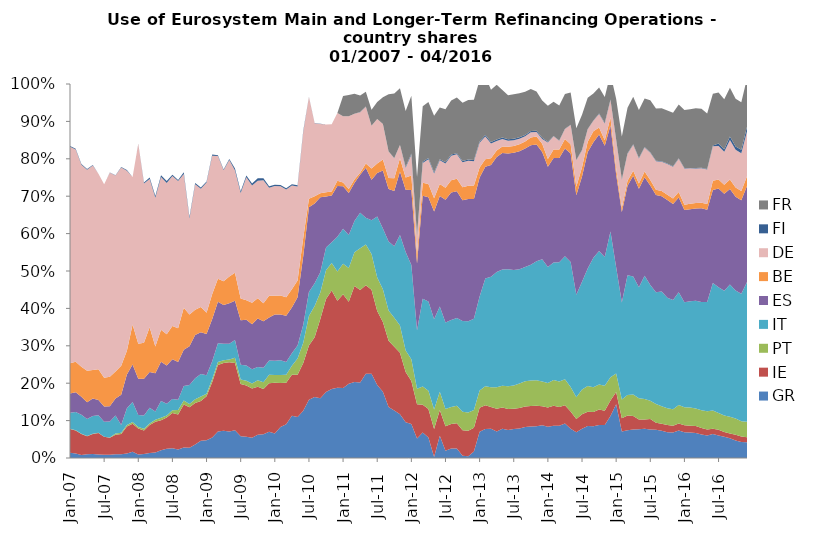
| Category | GR | IE | PT | IT | ES | BE | DE | FI | FR |
|---|---|---|---|---|---|---|---|---|---|
| 2007-01-01 | 0.014 | 0.064 | 0 | 0.043 | 0.051 | 0.081 | 0.579 | 0.002 | 0 |
| 2007-02-01 | 0.012 | 0.062 | 0 | 0.048 | 0.053 | 0.081 | 0.568 | 0.002 | 0 |
| 2007-03-01 | 0.008 | 0.056 | 0 | 0.051 | 0.048 | 0.08 | 0.54 | 0.002 | 0 |
| 2007-04-01 | 0.01 | 0.048 | 0.001 | 0.045 | 0.045 | 0.084 | 0.538 | 0.002 | 0 |
| 2007-05-01 | 0.011 | 0.053 | 0 | 0.048 | 0.047 | 0.076 | 0.547 | 0.001 | 0 |
| 2007-06-01 | 0.009 | 0.057 | 0.001 | 0.047 | 0.041 | 0.082 | 0.522 | 0 | 0 |
| 2007-07-01 | 0.009 | 0.048 | 0 | 0.04 | 0.041 | 0.077 | 0.518 | 0 | 0 |
| 2007-08-01 | 0.009 | 0.046 | 0.001 | 0.043 | 0.041 | 0.079 | 0.546 | 0 | 0 |
| 2007-09-01 | 0.01 | 0.052 | 0.003 | 0.048 | 0.046 | 0.072 | 0.524 | 0.001 | 0 |
| 2007-10-01 | 0.01 | 0.054 | 0.003 | 0.021 | 0.081 | 0.077 | 0.53 | 0.001 | 0 |
| 2007-11-01 | 0.012 | 0.072 | 0.004 | 0.045 | 0.09 | 0.064 | 0.481 | 0.002 | 0 |
| 2007-12-01 | 0.017 | 0.075 | 0.005 | 0.054 | 0.1 | 0.107 | 0.394 | 0 | 0 |
| 2008-01-01 | 0.009 | 0.069 | 0.004 | 0.032 | 0.096 | 0.094 | 0.535 | 0 | 0 |
| 2008-02-01 | 0.011 | 0.063 | 0.005 | 0.035 | 0.098 | 0.096 | 0.425 | 0.002 | 0 |
| 2008-03-01 | 0.014 | 0.075 | 0.004 | 0.042 | 0.096 | 0.12 | 0.396 | 0.004 | 0 |
| 2008-04-01 | 0.015 | 0.082 | 0.006 | 0.022 | 0.102 | 0.072 | 0.398 | 0.004 | 0 |
| 2008-05-01 | 0.021 | 0.08 | 0.007 | 0.045 | 0.105 | 0.086 | 0.409 | 0.005 | 0 |
| 2008-06-01 | 0.025 | 0.083 | 0.005 | 0.032 | 0.102 | 0.083 | 0.404 | 0.005 | 0 |
| 2008-07-01 | 0.026 | 0.095 | 0.007 | 0.03 | 0.106 | 0.089 | 0.401 | 0.004 | 0 |
| 2008-08-01 | 0.023 | 0.093 | 0.012 | 0.027 | 0.101 | 0.09 | 0.394 | 0.003 | 0 |
| 2008-09-01 | 0.028 | 0.115 | 0.011 | 0.038 | 0.097 | 0.112 | 0.358 | 0.005 | 0 |
| 2008-10-01 | 0.027 | 0.108 | 0.009 | 0.051 | 0.104 | 0.085 | 0.257 | 0.004 | 0 |
| 2008-11-01 | 0.036 | 0.111 | 0.01 | 0.056 | 0.115 | 0.067 | 0.336 | 0.003 | 0 |
| 2008-12-01 | 0.046 | 0.106 | 0.012 | 0.06 | 0.111 | 0.068 | 0.317 | 0.003 | 0 |
| 2009-01-01 | 0.047 | 0.117 | 0.007 | 0.05 | 0.11 | 0.057 | 0.348 | 0.002 | 0 |
| 2009-02-01 | 0.055 | 0.148 | 0.007 | 0.048 | 0.112 | 0.067 | 0.37 | 0.003 | 0 |
| 2009-03-01 | 0.071 | 0.178 | 0.008 | 0.05 | 0.111 | 0.062 | 0.328 | 0.002 | 0 |
| 2009-04-01 | 0.073 | 0.181 | 0.007 | 0.044 | 0.104 | 0.064 | 0.296 | 0.002 | 0 |
| 2009-05-01 | 0.071 | 0.185 | 0.008 | 0.042 | 0.108 | 0.071 | 0.312 | 0.002 | 0 |
| 2009-06-01 | 0.074 | 0.18 | 0.015 | 0.047 | 0.105 | 0.075 | 0.273 | 0.005 | 0 |
| 2009-07-01 | 0.058 | 0.14 | 0.012 | 0.04 | 0.119 | 0.058 | 0.282 | 0.005 | 0 |
| 2009-08-01 | 0.057 | 0.137 | 0.013 | 0.041 | 0.122 | 0.052 | 0.329 | 0.005 | 0 |
| 2009-09-01 | 0.054 | 0.132 | 0.013 | 0.038 | 0.121 | 0.057 | 0.314 | 0.005 | 0 |
| 2009-10-01 | 0.062 | 0.129 | 0.017 | 0.036 | 0.13 | 0.054 | 0.314 | 0.006 | 0 |
| 2009-11-01 | 0.064 | 0.121 | 0.018 | 0.038 | 0.125 | 0.048 | 0.329 | 0.005 | 0 |
| 2009-12-01 | 0.07 | 0.13 | 0.023 | 0.038 | 0.115 | 0.058 | 0.289 | 0.004 | 0 |
| 2010-01-01 | 0.066 | 0.135 | 0.021 | 0.038 | 0.124 | 0.05 | 0.293 | 0.004 | 0 |
| 2010-02-01 | 0.083 | 0.118 | 0.021 | 0.039 | 0.123 | 0.05 | 0.292 | 0.003 | 0 |
| 2010-03-01 | 0.09 | 0.111 | 0.021 | 0.034 | 0.124 | 0.05 | 0.288 | 0.003 | 0 |
| 2010-04-01 | 0.113 | 0.109 | 0.024 | 0.034 | 0.122 | 0.049 | 0.277 | 0.003 | 0 |
| 2010-05-01 | 0.109 | 0.113 | 0.043 | 0.035 | 0.129 | 0.044 | 0.251 | 0.003 | 0 |
| 2010-06-01 | 0.127 | 0.127 | 0.054 | 0.048 | 0.184 | 0.049 | 0.283 | 0.003 | 0 |
| 2010-07-01 | 0.156 | 0.145 | 0.079 | 0.064 | 0.227 | 0.022 | 0.272 | 0.001 | 0 |
| 2010-08-01 | 0.163 | 0.16 | 0.084 | 0.06 | 0.214 | 0.019 | 0.195 | 0.001 | 0 |
| 2010-09-01 | 0.16 | 0.212 | 0.071 | 0.054 | 0.201 | 0.011 | 0.185 | 0.001 | 0 |
| 2010-10-01 | 0.177 | 0.249 | 0.077 | 0.061 | 0.136 | 0.011 | 0.181 | 0 | 0 |
| 2010-11-01 | 0.184 | 0.264 | 0.074 | 0.056 | 0.125 | 0.011 | 0.18 | 0 | 0 |
| 2010-12-01 | 0.188 | 0.233 | 0.078 | 0.093 | 0.136 | 0.014 | 0.181 | 0 | 0 |
| 2011-01-01 | 0.187 | 0.25 | 0.081 | 0.094 | 0.113 | 0.01 | 0.177 | 0 | 0.054 |
| 2011-02-01 | 0.199 | 0.219 | 0.09 | 0.088 | 0.112 | 0.011 | 0.195 | 0 | 0.057 |
| 2011-03-01 | 0.203 | 0.257 | 0.09 | 0.083 | 0.101 | 0.01 | 0.176 | 0 | 0.054 |
| 2011-04-01 | 0.202 | 0.247 | 0.112 | 0.095 | 0.102 | 0.005 | 0.162 | 0 | 0.044 |
| 2011-05-01 | 0.225 | 0.236 | 0.109 | 0.071 | 0.134 | 0.012 | 0.152 | 0 | 0.04 |
| 2011-06-01 | 0.225 | 0.225 | 0.096 | 0.09 | 0.108 | 0.03 | 0.114 | 0 | 0.043 |
| 2011-07-01 | 0.195 | 0.198 | 0.09 | 0.163 | 0.116 | 0.025 | 0.119 | 0 | 0.045 |
| 2011-08-01 | 0.177 | 0.186 | 0.088 | 0.162 | 0.155 | 0.029 | 0.095 | 0 | 0.071 |
| 2011-09-01 | 0.137 | 0.177 | 0.081 | 0.185 | 0.14 | 0.029 | 0.071 | 0 | 0.153 |
| 2011-10-01 | 0.127 | 0.17 | 0.078 | 0.191 | 0.148 | 0.034 | 0.054 | 0 | 0.172 |
| 2011-11-01 | 0.117 | 0.164 | 0.073 | 0.242 | 0.17 | 0.036 | 0.035 | 0 | 0.152 |
| 2011-12-01 | 0.096 | 0.134 | 0.058 | 0.264 | 0.166 | 0.033 | 0.026 | 0.003 | 0.149 |
| 2012-01-01 | 0.091 | 0.115 | 0.058 | 0.252 | 0.201 | 0.039 | 0.056 | 0.003 | 0.155 |
| 2012-02-01 | 0.052 | 0.092 | 0.042 | 0.156 | 0.179 | 0.024 | 0.051 | 0.002 | 0.154 |
| 2012-03-01 | 0.068 | 0.074 | 0.049 | 0.235 | 0.275 | 0.035 | 0.053 | 0.003 | 0.149 |
| 2012-04-01 | 0.055 | 0.076 | 0.049 | 0.239 | 0.279 | 0.035 | 0.066 | 0.003 | 0.15 |
| 2012-05-01 | 0.003 | 0.075 | 0.052 | 0.242 | 0.288 | 0.035 | 0.066 | 0.003 | 0.151 |
| 2012-06-01 | 0.06 | 0.069 | 0.049 | 0.228 | 0.295 | 0.032 | 0.063 | 0.003 | 0.138 |
| 2012-07-31 | 0.02 | 0.065 | 0.046 | 0.231 | 0.328 | 0.032 | 0.065 | 0.003 | 0.142 |
| 2012-08-31 | 0.026 | 0.066 | 0.045 | 0.232 | 0.341 | 0.033 | 0.065 | 0.003 | 0.145 |
| 2012-09-30 | 0.026 | 0.067 | 0.047 | 0.234 | 0.339 | 0.034 | 0.065 | 0.003 | 0.149 |
| 2012-10-31 | 0.006 | 0.069 | 0.049 | 0.243 | 0.322 | 0.035 | 0.067 | 0.003 | 0.156 |
| 2012-11-30 | 0.005 | 0.068 | 0.049 | 0.244 | 0.326 | 0.036 | 0.067 | 0.003 | 0.159 |
| 2012-12-31 | 0.017 | 0.064 | 0.047 | 0.244 | 0.32 | 0.036 | 0.065 | 0.003 | 0.161 |
| 2013-01-31 | 0.07 | 0.064 | 0.046 | 0.252 | 0.318 | 0.027 | 0.066 | 0.003 | 0.165 |
| 2013-02-28 | 0.077 | 0.064 | 0.051 | 0.289 | 0.299 | 0.02 | 0.061 | 0.004 | 0.157 |
| 2013-03-31 | 0.078 | 0.059 | 0.053 | 0.296 | 0.299 | 0.018 | 0.039 | 0.004 | 0.14 |
| 2013-04-30 | 0.071 | 0.061 | 0.058 | 0.308 | 0.307 | 0.018 | 0.025 | 0.004 | 0.146 |
| 2013-05-31 | 0.078 | 0.056 | 0.058 | 0.311 | 0.311 | 0.017 | 0.02 | 0.004 | 0.127 |
| 2013-06-30 | 0.075 | 0.056 | 0.06 | 0.313 | 0.31 | 0.018 | 0.016 | 0.004 | 0.118 |
| 2013-07-31 | 0.077 | 0.054 | 0.062 | 0.308 | 0.314 | 0.018 | 0.015 | 0.004 | 0.119 |
| 2013-08-31 | 0.079 | 0.055 | 0.065 | 0.306 | 0.316 | 0.018 | 0.015 | 0.004 | 0.118 |
| 2013-09-30 | 0.083 | 0.055 | 0.067 | 0.305 | 0.317 | 0.019 | 0.014 | 0.003 | 0.116 |
| 2013-10-31 | 0.084 | 0.055 | 0.068 | 0.31 | 0.319 | 0.021 | 0.014 | 0.003 | 0.112 |
| 2013-11-30 | 0.085 | 0.055 | 0.068 | 0.318 | 0.312 | 0.021 | 0.012 | 0.003 | 0.105 |
| 2013-12-31 | 0.088 | 0.051 | 0.066 | 0.327 | 0.287 | 0.022 | 0.012 | 0.003 | 0.099 |
| 2014-01-31 | 0.084 | 0.051 | 0.065 | 0.31 | 0.268 | 0.021 | 0.044 | 0.002 | 0.096 |
| 2014-02-28 | 0.086 | 0.054 | 0.069 | 0.314 | 0.28 | 0.022 | 0.036 | 0.001 | 0.092 |
| 2014-03-31 | 0.086 | 0.051 | 0.068 | 0.319 | 0.279 | 0.022 | 0.023 | 0.001 | 0.093 |
| 2014-04-30 | 0.092 | 0.049 | 0.07 | 0.329 | 0.288 | 0.025 | 0.027 | 0.001 | 0.093 |
| 2014-05-31 | 0.078 | 0.046 | 0.065 | 0.334 | 0.29 | 0.025 | 0.051 | 0.001 | 0.087 |
| 2014-06-30 | 0.069 | 0.035 | 0.059 | 0.274 | 0.266 | 0.023 | 0.071 | 0.001 | 0.085 |
| 2014-07-31 | 0.078 | 0.039 | 0.066 | 0.289 | 0.281 | 0.025 | 0.046 | 0.001 | 0.094 |
| 2014-08-31 | 0.085 | 0.038 | 0.069 | 0.314 | 0.312 | 0.027 | 0.034 | 0.001 | 0.084 |
| 2014-09-30 | 0.085 | 0.038 | 0.066 | 0.346 | 0.308 | 0.029 | 0.028 | 0.001 | 0.072 |
| 2014-10-31 | 0.088 | 0.041 | 0.067 | 0.357 | 0.311 | 0.019 | 0.036 | 0.001 | 0.07 |
| 2014-11-30 | 0.088 | 0.038 | 0.067 | 0.344 | 0.297 | 0.014 | 0.045 | 0.002 | 0.069 |
| 2014-12-31 | 0.112 | 0.041 | 0.062 | 0.389 | 0.284 | 0.022 | 0.047 | 0.001 | 0.069 |
| 2015-01-31 | 0.143 | 0.033 | 0.049 | 0.285 | 0.248 | 0.016 | 0.077 | 0.001 | 0.109 |
| 2015-02-28 | 0.071 | 0.035 | 0.051 | 0.259 | 0.242 | 0.011 | 0.075 | 0.001 | 0.115 |
| 2015-03-31 | 0.074 | 0.039 | 0.054 | 0.32 | 0.239 | 0.014 | 0.072 | 0.001 | 0.121 |
| 2015-04-30 | 0.076 | 0.036 | 0.058 | 0.315 | 0.269 | 0.014 | 0.069 | 0.001 | 0.127 |
| 2015-05-31 | 0.077 | 0.026 | 0.057 | 0.297 | 0.264 | 0.014 | 0.067 | 0.001 | 0.128 |
| 2015-06-30 | 0.078 | 0.024 | 0.055 | 0.33 | 0.263 | 0.015 | 0.064 | 0.001 | 0.13 |
| 2015-07-31 | 0.076 | 0.028 | 0.049 | 0.31 | 0.266 | 0.014 | 0.073 | 0.001 | 0.139 |
| 2015-08-31 | 0.075 | 0.019 | 0.05 | 0.299 | 0.26 | 0.014 | 0.076 | 0.001 | 0.14 |
| 2015-09-30 | 0.073 | 0.019 | 0.047 | 0.307 | 0.254 | 0.014 | 0.078 | 0.001 | 0.142 |
| 2015-10-31 | 0.069 | 0.019 | 0.045 | 0.296 | 0.261 | 0.015 | 0.082 | 0.001 | 0.142 |
| 2015-11-30 | 0.068 | 0.018 | 0.044 | 0.292 | 0.257 | 0.015 | 0.085 | 0.001 | 0.143 |
| 2015-12-31 | 0.073 | 0.019 | 0.05 | 0.301 | 0.254 | 0.015 | 0.089 | 0.001 | 0.144 |
| 2016-01-31 | 0.069 | 0.019 | 0.048 | 0.28 | 0.247 | 0.014 | 0.097 | 0.001 | 0.155 |
| 2016-02-29 | 0.068 | 0.018 | 0.049 | 0.284 | 0.246 | 0.015 | 0.094 | 0.001 | 0.157 |
| 2016-03-31 | 0.067 | 0.019 | 0.047 | 0.288 | 0.247 | 0.015 | 0.092 | 0.001 | 0.16 |
| 2016-04-30 | 0.063 | 0.017 | 0.048 | 0.29 | 0.25 | 0.015 | 0.093 | 0.001 | 0.158 |
| 2016-05-31 | 0.06 | 0.016 | 0.049 | 0.292 | 0.247 | 0.015 | 0.093 | 0.001 | 0.148 |
| 2016-06-30 | 0.064 | 0.014 | 0.049 | 0.341 | 0.249 | 0.025 | 0.093 | 0.002 | 0.139 |
| 2016-07-31 | 0.06 | 0.015 | 0.045 | 0.336 | 0.264 | 0.024 | 0.089 | 0.007 | 0.136 |
| 2016-08-31 | 0.057 | 0.013 | 0.044 | 0.334 | 0.26 | 0.024 | 0.088 | 0.007 | 0.133 |
| 2016-09-30 | 0.053 | 0.013 | 0.045 | 0.354 | 0.256 | 0.026 | 0.105 | 0.009 | 0.131 |
| 2016-10-31 | 0.047 | 0.015 | 0.043 | 0.342 | 0.251 | 0.025 | 0.101 | 0.009 | 0.128 |
| 2016-11-30 | 0.043 | 0.015 | 0.041 | 0.341 | 0.25 | 0.025 | 0.101 | 0.009 | 0.127 |
| 2016-12-31 | 0.042 | 0.014 | 0.041 | 0.374 | 0.256 | 0.026 | 0.12 | 0.012 | 0.13 |